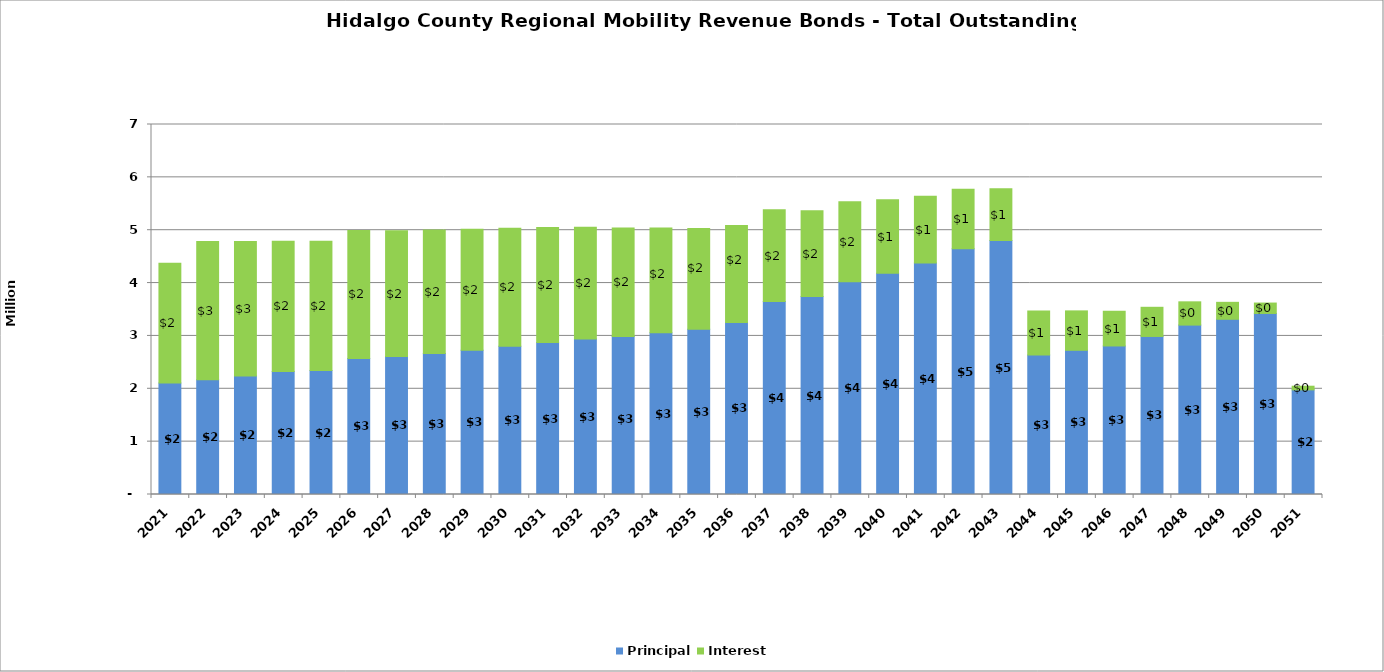
| Category | Principal | Interest |
|---|---|---|
| 2021.0 | 2110000 | 2265651 |
| 2022.0 | 2170000 | 2617817 |
| 2023.0 | 2240000 | 2544317 |
| 2024.0 | 2325000 | 2466530 |
| 2025.0 | 2345000 | 2444117 |
| 2026.0 | 2575000 | 2419167 |
| 2027.0 | 2612000 | 2379558 |
| 2028.0 | 2667000 | 2337002 |
| 2029.0 | 2730000 | 2287925 |
| 2030.0 | 2804000 | 2234896 |
| 2031.0 | 2875000 | 2177529 |
| 2032.0 | 2940000 | 2115917 |
| 2033.0 | 2990000 | 2050240 |
| 2034.0 | 3060000 | 1982115 |
| 2035.0 | 3125000 | 1909632 |
| 2036.0 | 3255000 | 1833182 |
| 2037.0 | 3650000 | 1736044 |
| 2038.0 | 3744000 | 1625581 |
| 2039.0 | 4025000 | 1512328 |
| 2040.0 | 4185000 | 1389769 |
| 2041.0 | 4380000 | 1262140 |
| 2042.0 | 4649000 | 1126264 |
| 2043.0 | 4805000 | 981474 |
| 2044.0 | 2639000 | 831753 |
| 2045.0 | 2728000 | 745738 |
| 2046.0 | 2810000 | 656808 |
| 2047.0 | 2990000 | 551733 |
| 2048.0 | 3205000 | 440083 |
| 2049.0 | 3315000 | 320633 |
| 2050.0 | 3425000 | 197033 |
| 2051.0 | 1979510 | 69279 |